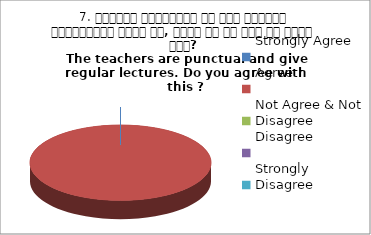
| Category | 7. शिक्षक समयनिष्ट है एवं नियमित व्याख्यान देते है, क्या आप इस बात से सहमत हैं? 
The teachers are punctual and give regular lectures. Do you agree with this ?
 Agree Agree Agree Agree Agree |
|---|---|
| Strongly Agree | 0 |
| Agree | 5 |
| Not Agree & Not Disagree | 0 |
| Disagree | 0 |
| Strongly Disagree | 0 |